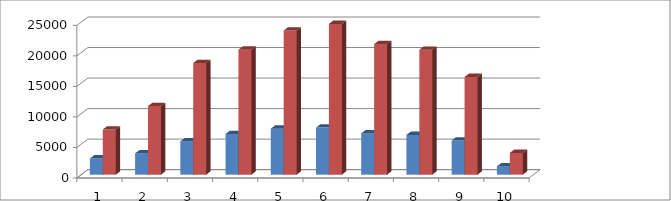
| Category | Series 0 | Series 1 |
|---|---|---|
| 0 | 2656 | 7396 |
| 1 | 3483 | 11230 |
| 2 | 5449 | 18282 |
| 3 | 6666 | 20471 |
| 4 | 7527 | 23613 |
| 5 | 7707 | 24697 |
| 6 | 6758 | 21385 |
| 7 | 6512 | 20453 |
| 8 | 5598 | 16005 |
| 9 | 1357 | 3563 |